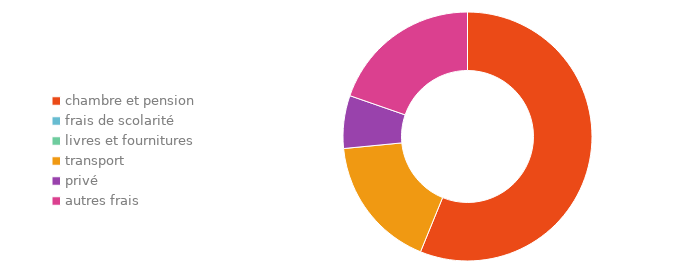
| Category | Series 0 |
|---|---|
| chambre et pension | 0 |
| frais de scolarité | 0 |
| livres et fournitures | 0 |
| transport | 0 |
| privé | 0 |
| autres frais | 0 |